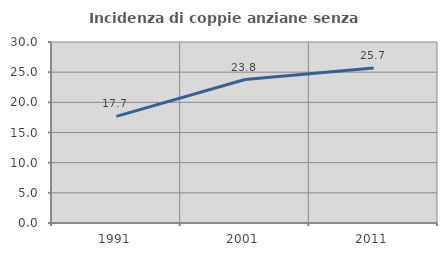
| Category | Incidenza di coppie anziane senza figli  |
|---|---|
| 1991.0 | 17.68 |
| 2001.0 | 23.775 |
| 2011.0 | 25.697 |